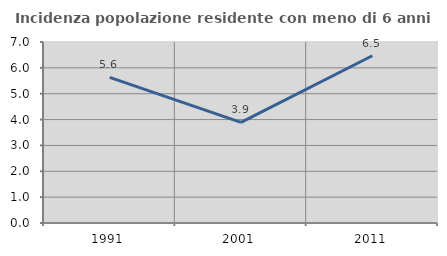
| Category | Incidenza popolazione residente con meno di 6 anni |
|---|---|
| 1991.0 | 5.634 |
| 2001.0 | 3.893 |
| 2011.0 | 6.47 |